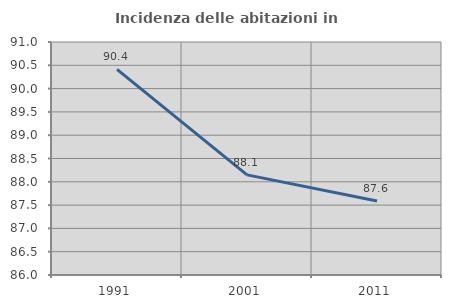
| Category | Incidenza delle abitazioni in proprietà  |
|---|---|
| 1991.0 | 90.411 |
| 2001.0 | 88.148 |
| 2011.0 | 87.586 |